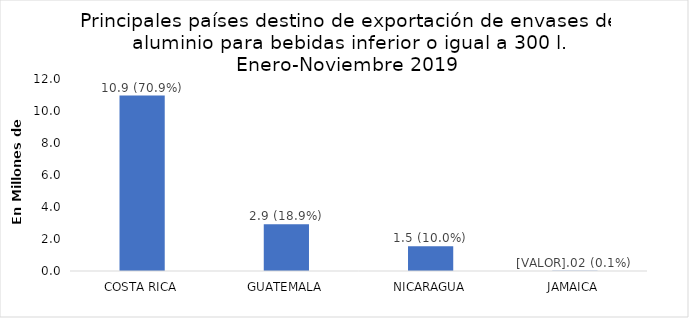
| Category | Series 0 |
|---|---|
| COSTA RICA | 10966979 |
| GUATEMALA | 2925670 |
| NICARAGUA | 1544568 |
| JAMAICA | 21894 |